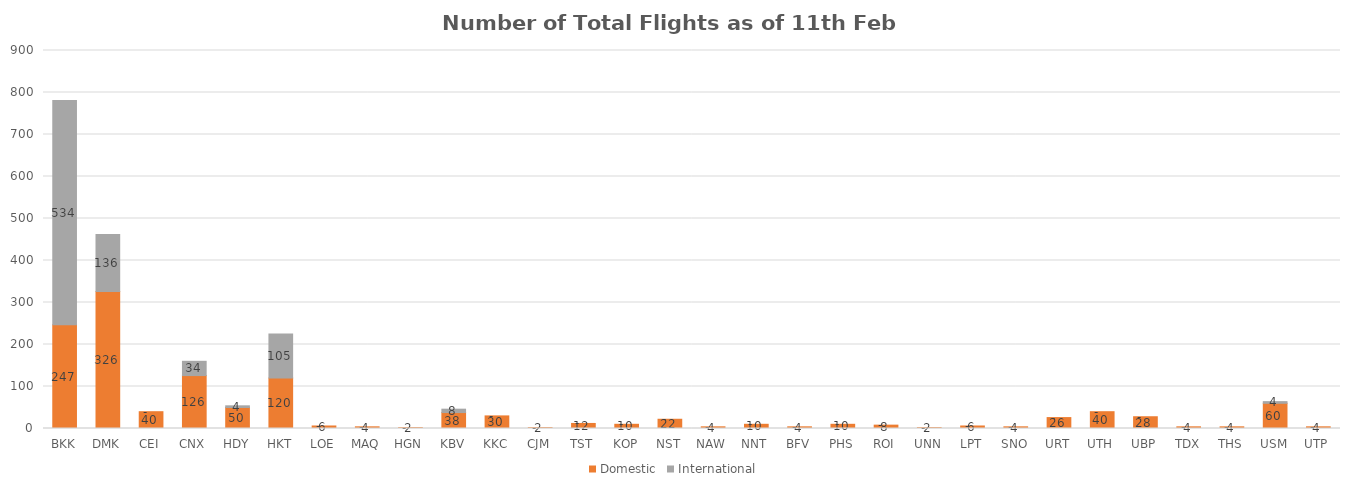
| Category | Domestic | International |
|---|---|---|
| BKK | 247 | 534 |
| DMK | 326 | 136 |
| CEI | 40 | 0 |
| CNX | 126 | 34 |
| HDY | 50 | 4 |
| HKT | 120 | 105 |
| LOE | 6 | 0 |
| MAQ | 4 | 0 |
| HGN | 2 | 0 |
| KBV | 38 | 8 |
| KKC | 30 | 0 |
| CJM | 2 | 0 |
| TST | 12 | 0 |
| KOP | 10 | 0 |
| NST | 22 | 0 |
| NAW | 4 | 0 |
| NNT | 10 | 0 |
| BFV | 4 | 0 |
| PHS | 10 | 0 |
| ROI | 8 | 0 |
| UNN | 2 | 0 |
| LPT | 6 | 0 |
| SNO | 4 | 0 |
| URT | 26 | 0 |
| UTH | 40 | 0 |
| UBP | 28 | 0 |
| TDX | 4 | 0 |
| THS | 4 | 0 |
| USM | 60 | 4 |
| UTP | 4 | 0 |